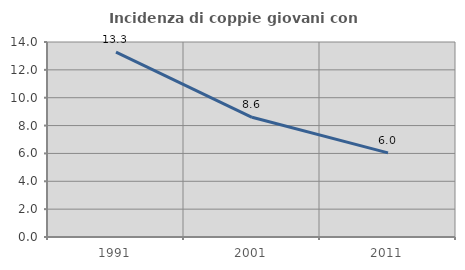
| Category | Incidenza di coppie giovani con figli |
|---|---|
| 1991.0 | 13.271 |
| 2001.0 | 8.593 |
| 2011.0 | 6.041 |